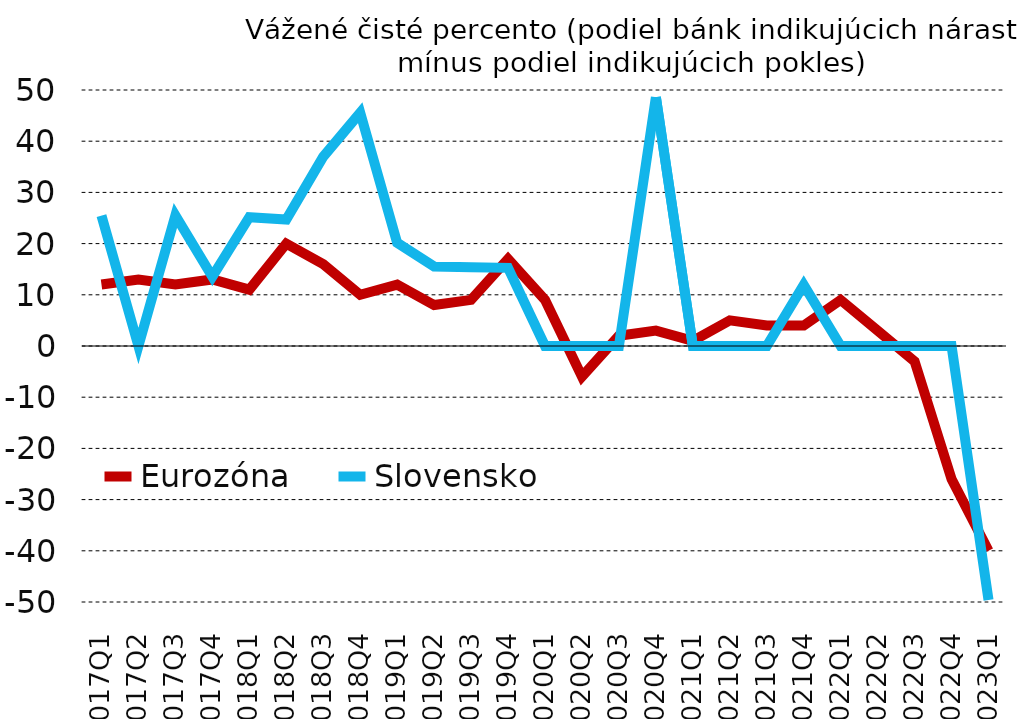
| Category | Eurozóna | Slovensko |
|---|---|---|
| 2017Q1 | 12 | 25.46 |
| 2017Q2 | 13 | 0 |
| 2017Q3 | 12 | 25.5 |
| 2017Q4 | 13 | 13.53 |
| 2018Q1 | 11 | 25.16 |
| 2018Q2 | 20 | 24.69 |
| 2018Q3 | 16 | 36.98 |
| 2018Q4 | 10 | 45.56 |
| 2019Q1 | 12 | 20.16 |
| 2019Q2 | 8 | 15.53 |
| 2019Q3 | 9 | 15.4 |
| 2019Q4 | 17 | 15.26 |
| 2020Q1 | 9 | 0 |
| 2020Q2 | -6 | 0 |
| 2020Q3 | 2 | 0 |
| 2020Q4 | 3 | 48.61 |
| 2021Q1 | 1 | 0 |
| 2021Q2 | 5 | 0 |
| 2021Q3 | 4 | 0 |
| 2021Q4 | 4 | 11.92 |
| 2022Q1 | 9 | 0 |
| 2022Q2 | 3 | 0 |
| 2022Q3 | -3 | 0 |
| 2022Q4 | -26 | 0 |
| 2023Q1 | -40 | -49.61 |